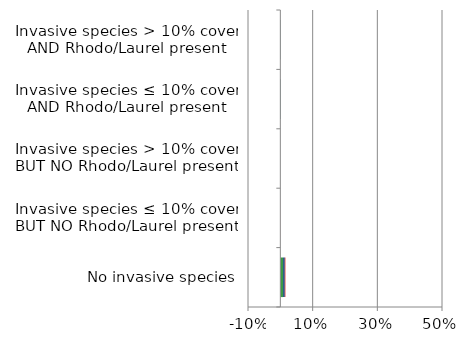
| Category | England | Scotland | Wales |
|---|---|---|---|
| No invasive species | 0.009 | 0.005 | 0.002 |
| Invasive species ≤ 10% cover BUT NO Rhodo/Laurel present | 0 | 0 | 0 |
| Invasive species > 10% cover BUT NO Rhodo/Laurel present | 0 | 0 | 0 |
| Invasive species ≤ 10% cover AND Rhodo/Laurel present | 0.001 | 0.001 | 0 |
| Invasive species > 10% cover AND Rhodo/Laurel present | 0 | 0.001 | 0 |